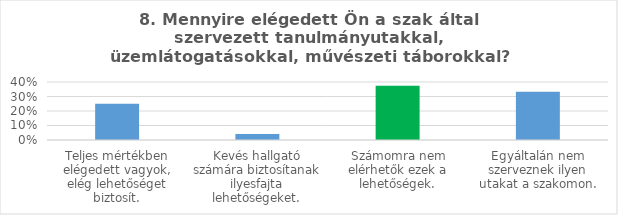
| Category | Series 0 |
|---|---|
| Teljes mértékben elégedett vagyok, elég lehetőséget biztosít. | 0.25 |
| Kevés hallgató számára biztosítanak ilyesfajta lehetőségeket. | 0.042 |
| Számomra nem elérhetők ezek a lehetőségek. | 0.375 |
| Egyáltalán nem szerveznek ilyen utakat a szakomon. | 0.333 |